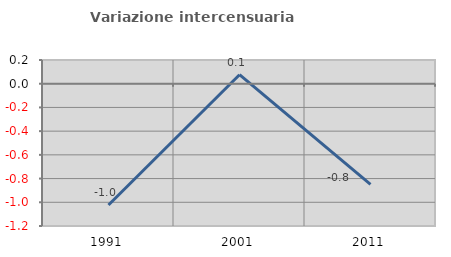
| Category | Variazione intercensuaria annua |
|---|---|
| 1991.0 | -1.022 |
| 2001.0 | 0.076 |
| 2011.0 | -0.849 |